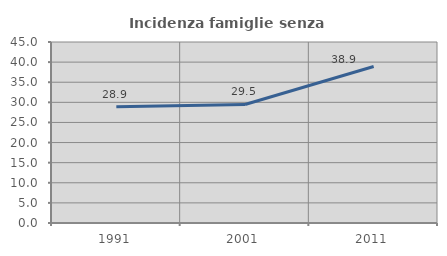
| Category | Incidenza famiglie senza nuclei |
|---|---|
| 1991.0 | 28.885 |
| 2001.0 | 29.475 |
| 2011.0 | 38.918 |